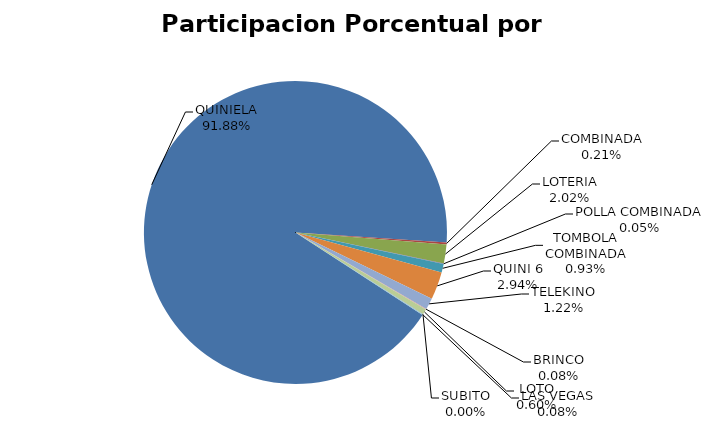
| Category | Series 0 |
|---|---|
| QUINIELA | 82008054.54 |
| COMBINADA | 190907.67 |
| LOTERIA | 1806356.32 |
| POLLA COMBINADA | 42522.75 |
| TOMBOLA COMBINADA | 829889 |
| QUINI 6 | 2618800.68 |
| TELEKINO | 1090617.14 |
| BRINCO | 67107.37 |
| LOTO | 530764.48 |
| SUBITO | 0 |
| LAS VEGAS | 71763 |